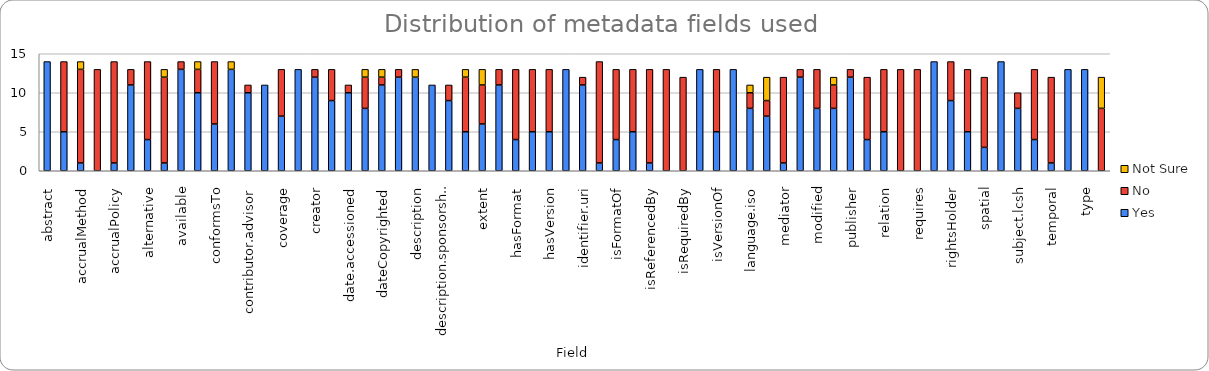
| Category | Yes | No | Not Sure |
|---|---|---|---|
| abstract | 14 | 0 | 0 |
| accessRights | 5 | 9 | 0 |
| accrualMethod | 1 | 12 | 1 |
| accrualPeriodicity | 0 | 13 | 0 |
| accrualPolicy | 1 | 13 | 0 |
| acknowledgement / sponsor | 11 | 2 | 0 |
| alternative | 4 | 10 | 0 |
| audience | 1 | 11 | 1 |
| available | 13 | 1 | 0 |
| bibliographicCitation | 10 | 3 | 1 |
| conformsTo | 6 | 8 | 0 |
| contributor | 13 | 0 | 1 |
| contributor.advisor | 10 | 1 | 0 |
| contributor.author | 11 | 0 | 0 |
| coverage | 7 | 6 | 0 |
| created | 13 | 0 | 0 |
| creator | 12 | 1 | 0 |
| date | 9 | 4 | 0 |
| date.accessioned | 10 | 1 | 0 |
| dateAccepted | 8 | 4 | 1 |
| dateCopyrighted | 11 | 1 | 1 |
| dateSubmitted | 12 | 1 | 0 |
| description | 12 | 0 | 1 |
| description.level | 11 | 0 | 0 |
| description.sponsorship | 9 | 2 | 0 |
| educationLevel | 5 | 7 | 1 |
| extent | 6 | 5 | 2 |
| format | 11 | 2 | 0 |
| hasFormat | 4 | 9 | 0 |
| hasPart | 5 | 8 | 0 |
| hasVersion | 5 | 8 | 0 |
| identifier | 13 | 0 | 0 |
| identifier.uri | 11 | 1 | 0 |
| instructionalMethod | 1 | 13 | 0 |
| isFormatOf | 4 | 9 | 0 |
| isPartOf | 5 | 8 | 0 |
| isReferencedBy | 1 | 12 | 0 |
| isReplacedBy | 0 | 13 | 0 |
| isRequiredBy | 0 | 12 | 0 |
| issued | 13 | 0 | 0 |
| isVersionOf | 5 | 8 | 0 |
| language | 13 | 0 | 0 |
| language.iso | 8 | 2 | 1 |
| license | 7 | 2 | 3 |
| mediator | 1 | 11 | 0 |
| medium | 12 | 1 | 0 |
| modified | 8 | 5 | 0 |
| provenance | 8 | 3 | 1 |
| publisher | 12 | 1 | 0 |
| references | 4 | 8 | 0 |
| relation | 5 | 8 | 0 |
| replaces | 0 | 13 | 0 |
| requires | 0 | 13 | 0 |
| rights | 14 | 0 | 0 |
| rightsHolder | 9 | 5 | 0 |
| source | 5 | 8 | 0 |
| spatial | 3 | 9 | 0 |
| subject | 14 | 0 | 0 |
| subject.lcsh | 8 | 2 | 0 |
| tableOfContents | 4 | 9 | 0 |
| temporal | 1 | 11 | 0 |
| title | 13 | 0 | 0 |
| type | 13 | 0 | 0 |
| valid | 0 | 8 | 4 |